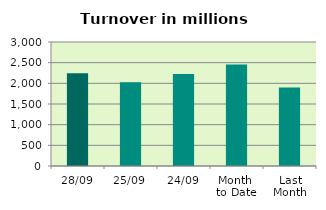
| Category | Series 0 |
|---|---|
| 28/09 | 2244.468 |
| 25/09 | 2024.501 |
| 24/09 | 2223.674 |
| Month 
to Date | 2455.924 |
| Last
Month | 1896.825 |